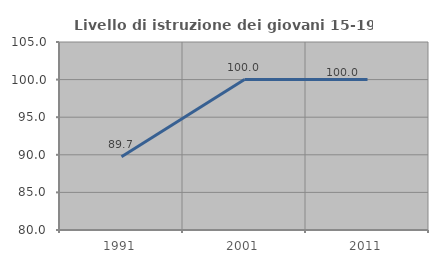
| Category | Livello di istruzione dei giovani 15-19 anni |
|---|---|
| 1991.0 | 89.744 |
| 2001.0 | 100 |
| 2011.0 | 100 |